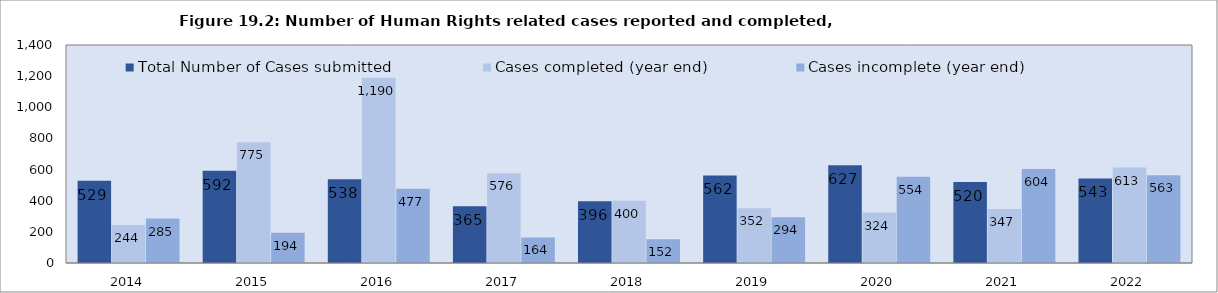
| Category | Total Number of Cases submitted  | Cases completed (year end) | Cases incomplete (year end) |
|---|---|---|---|
| 2014.0 | 529 | 244 | 285 |
| 2015.0 | 592 | 775 | 194 |
| 2016.0 | 538 | 1190 | 477 |
| 2017.0 | 365 | 576 | 164 |
| 2018.0 | 396 | 400 | 152 |
| 2019.0 | 562 | 352 | 294 |
| 2020.0 | 627 | 324 | 554 |
| 2021.0 | 520 | 347 | 604 |
| 2022.0 | 543 | 613 | 563 |